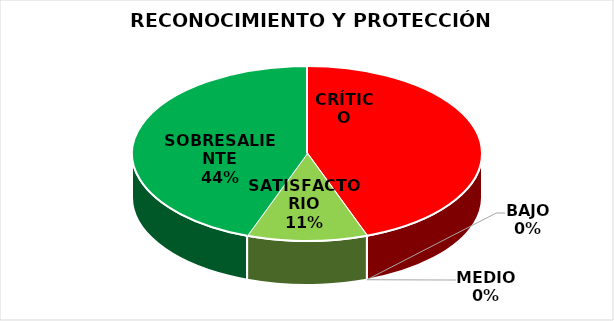
| Category | Series 0 |
|---|---|
| CRÍTICO | 8 |
| BAJO | 0 |
| MEDIO | 0 |
| SATISFACTORIO | 2 |
| SOBRESALIENTE | 8 |